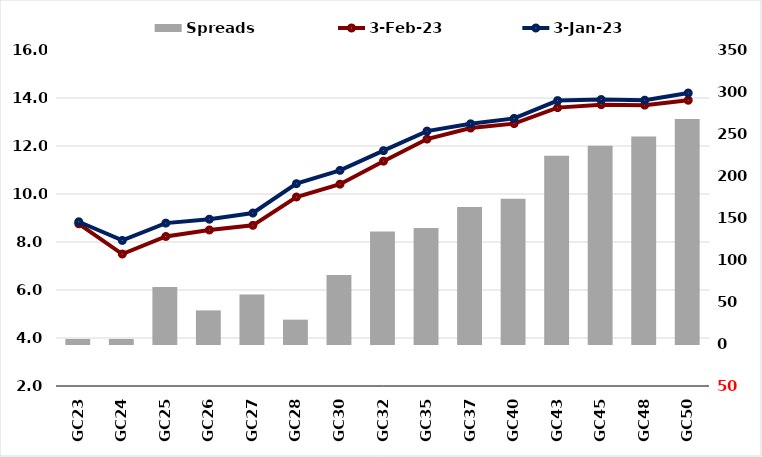
| Category |  Spreads   |
|---|---|
| GC23 | 6 |
| GC24 | 6 |
| GC25 | 68 |
| GC26 | 40 |
| GC27 | 59 |
| GC28 | 29 |
| GC30 | 82 |
| GC32 | 134 |
| GC35 | 138 |
| GC37 | 163 |
| GC40 | 173 |
| GC43 | 224 |
| GC45 | 236 |
| GC48 | 247 |
| GC50 | 268 |